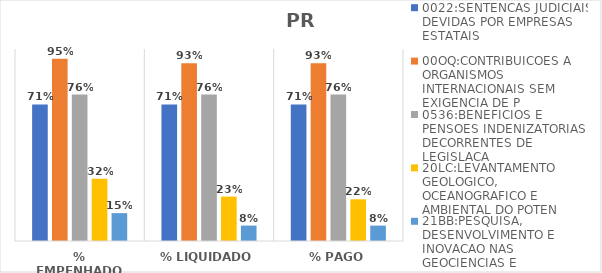
| Category | 0022:SENTENCAS JUDICIAIS DEVIDAS POR EMPRESAS ESTATAIS | 00OQ:CONTRIBUICOES A ORGANISMOS INTERNACIONAIS SEM EXIGENCIA DE P | 0536:BENEFICIOS E PENSOES INDENIZATORIAS DECORRENTES DE LEGISLACA | 20LC:LEVANTAMENTO GEOLOGICO, OCEANOGRAFICO E AMBIENTAL DO POTEN | 21BB:PESQUISA, DESENVOLVIMENTO E INOVACAO NAS GEOCIENCIAS E |
|---|---|---|---|---|---|
| % EMPENHADO | 0.711 | 0.95 | 0.763 | 0.325 | 0.145 |
| % LIQUIDADO | 0.711 | 0.926 | 0.763 | 0.231 | 0.08 |
| % PAGO | 0.711 | 0.926 | 0.763 | 0.217 | 0.08 |